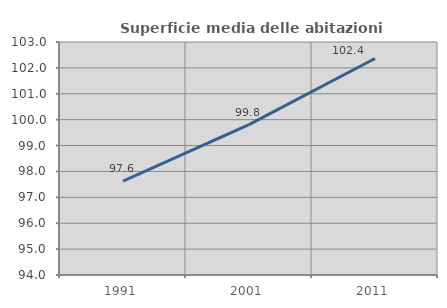
| Category | Superficie media delle abitazioni occupate |
|---|---|
| 1991.0 | 97.622 |
| 2001.0 | 99.809 |
| 2011.0 | 102.364 |